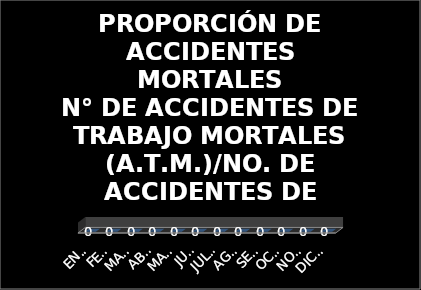
| Category | PROPORCIÓN DE ACCIDENTES MORTALES
N° DE ACCIDENTES DE TRABAJO MORTALES (A.T.M.)/NO. DE ACCIDENTES DE TRABAJO*100 |
|---|---|
| ENERO | 0 |
| FEBRERO | 0 |
| MARZO | 0 |
| ABRIL | 0 |
| MAYO | 0 |
| JUNIO | 0 |
| JULIO | 0 |
| AGOSTO | 0 |
| SEPTIEMBRE | 0 |
| OCTUBRE | 0 |
| NOVIEMBRE | 0 |
| DICIEMBRE | 0 |